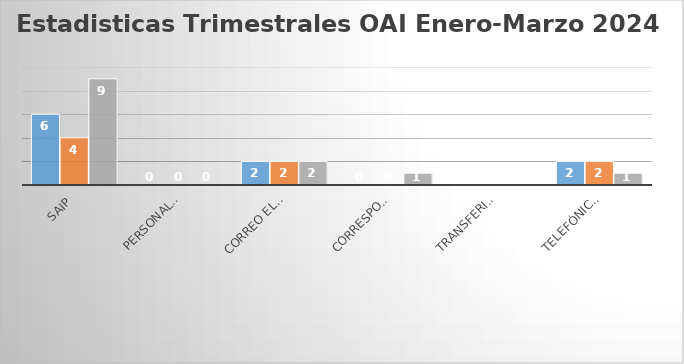
| Category | Series 0 | Series 1 | Series 2 |
|---|---|---|---|
| SAIP | 6 | 4 | 9 |
| personales | 0 | 0 | 0 |
| Correo Electronico  | 2 | 2 | 2 |
| Correspondencia | 0 | 0 | 1 |
| Transferidas | 0 | 0 | 0 |
| Telefónicas | 2 | 2 | 1 |